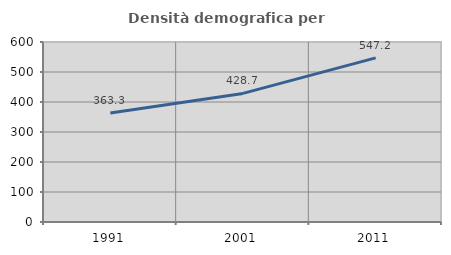
| Category | Densità demografica |
|---|---|
| 1991.0 | 363.323 |
| 2001.0 | 428.68 |
| 2011.0 | 547.177 |